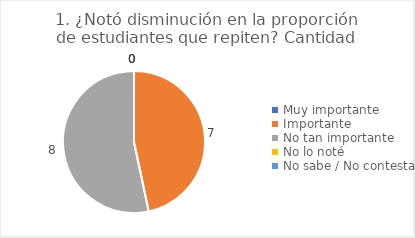
| Category | 1. ¿Notó disminución en la proporción de estudiantes que repiten? |
|---|---|
| Muy importante  | 0 |
| Importante  | 0.467 |
| No tan importante  | 0.533 |
| No lo noté  | 0 |
| No sabe / No contesta | 0 |